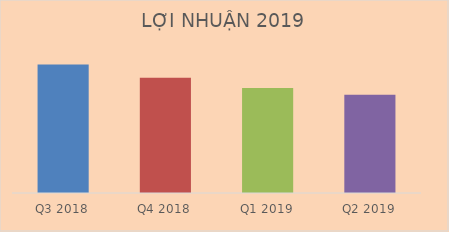
| Category | Doanh thu thuần |
|---|---|
| Q3 2018 | 1182805430175 |
| Q4 2018 | 1061828630748 |
| Q1 2019 | 968040417659 |
| Q2 2019 | 905903841233 |